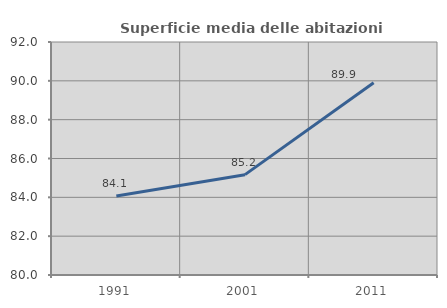
| Category | Superficie media delle abitazioni occupate |
|---|---|
| 1991.0 | 84.07 |
| 2001.0 | 85.168 |
| 2011.0 | 89.898 |